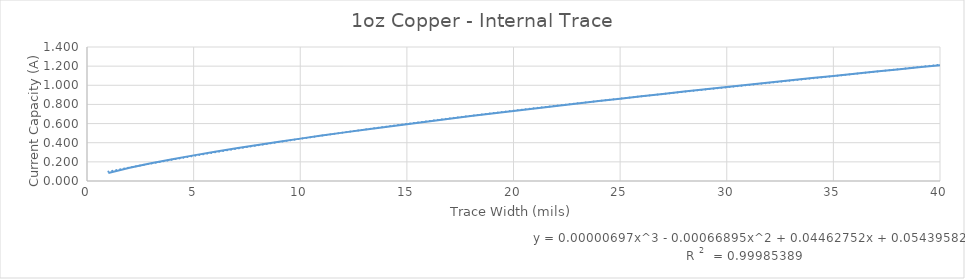
| Category | Series 0 |
|---|---|
| 0 | 0.083 |
| 1 | 0.138 |
| 2 | 0.185 |
| 3 | 0.228 |
| 4 | 0.268 |
| 5 | 0.306 |
| 6 | 0.342 |
| 7 | 0.377 |
| 8 | 0.41 |
| 9 | 0.443 |
| 10 | 0.474 |
| 11 | 0.505 |
| 12 | 0.536 |
| 13 | 0.565 |
| 14 | 0.594 |
| 15 | 0.623 |
| 16 | 0.65 |
| 17 | 0.678 |
| 18 | 0.705 |
| 19 | 0.732 |
| 20 | 0.758 |
| 21 | 0.784 |
| 22 | 0.81 |
| 23 | 0.835 |
| 24 | 0.86 |
| 25 | 0.885 |
| 26 | 0.91 |
| 27 | 0.934 |
| 28 | 0.958 |
| 29 | 0.982 |
| 30 | 1.006 |
| 31 | 1.029 |
| 32 | 1.052 |
| 33 | 1.075 |
| 34 | 1.098 |
| 35 | 1.121 |
| 36 | 1.143 |
| 37 | 1.165 |
| 38 | 1.188 |
| 39 | 1.21 |